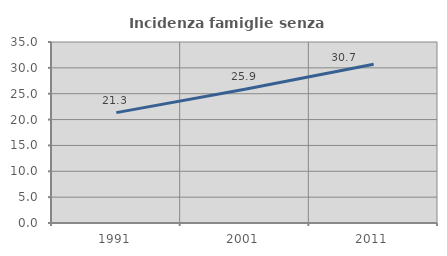
| Category | Incidenza famiglie senza nuclei |
|---|---|
| 1991.0 | 21.345 |
| 2001.0 | 25.87 |
| 2011.0 | 30.704 |